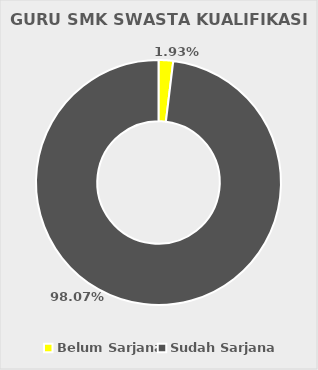
| Category | GURU SMK SWASTA KUALIFIKASI S1 |
|---|---|
| Belum Sarjana | 15 |
| Sudah Sarjana | 763 |